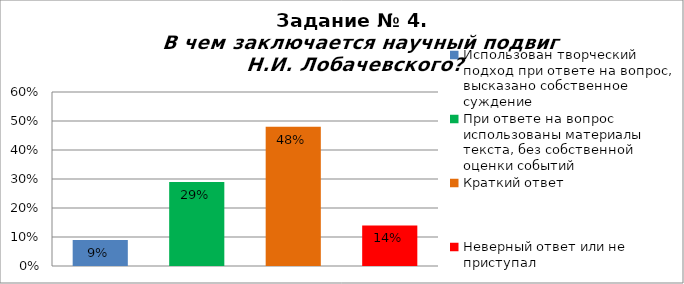
| Category | В чем заключается научный подвиг Н.И. Лобачевского? |
|---|---|
| Использован творческий подход при ответе на вопрос, высказано собственное суждение | 0.09 |
| При ответе на вопрос использованы материалы текста, без собственной оценки событий | 0.29 |
| Краткий ответ | 0.48 |
| Неверный ответ или не приступал | 0.14 |